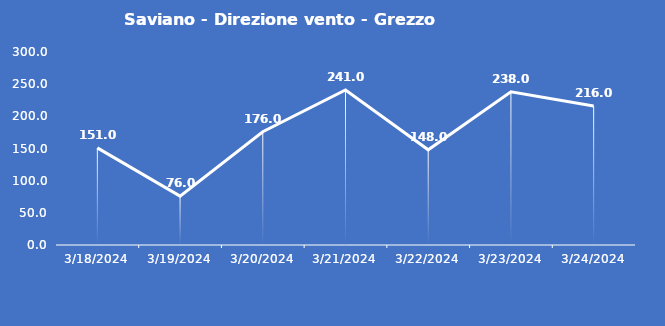
| Category | Saviano - Direzione vento - Grezzo (°N) |
|---|---|
| 3/18/24 | 151 |
| 3/19/24 | 76 |
| 3/20/24 | 176 |
| 3/21/24 | 241 |
| 3/22/24 | 148 |
| 3/23/24 | 238 |
| 3/24/24 | 216 |